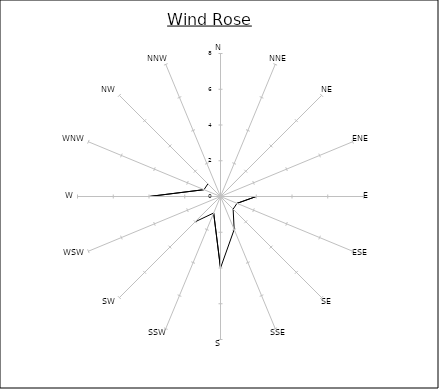
| Category | Series 0 |
|---|---|
| N | 8 |
| NNE | 0 |
| NE | 2 |
| ENE | 0 |
| E | 2 |
| ESE | 1 |
| SE | 1 |
| SSE | 2 |
| S | 4 |
| SSW | 1 |
| SW | 2 |
| WSW | 0 |
| W | 4 |
| WNW | 1 |
| NW | 1 |
| NNW | 0 |